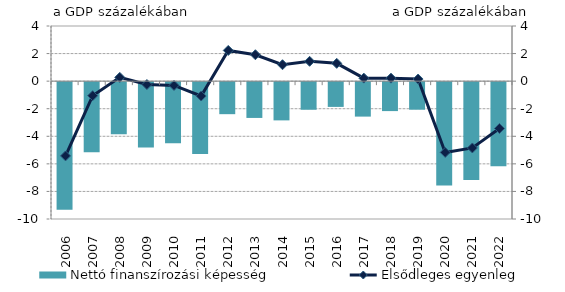
| Category | Nettó finanszírozási képesség |
|---|---|
| 2006.0 | -9.257 |
| 2007.0 | -5.082 |
| 2008.0 | -3.781 |
| 2009.0 | -4.748 |
| 2010.0 | -4.425 |
| 2011.0 | -5.209 |
| 2012.0 | -2.324 |
| 2013.0 | -2.597 |
| 2014.0 | -2.774 |
| 2015.0 | -2.003 |
| 2016.0 | -1.796 |
| 2017.0 | -2.5 |
| 2018.0 | -2.1 |
| 2019.0 | -2 |
| 2020.0 | -7.5 |
| 2021.0 | -7.1 |
| 2022.0 | -6.1 |